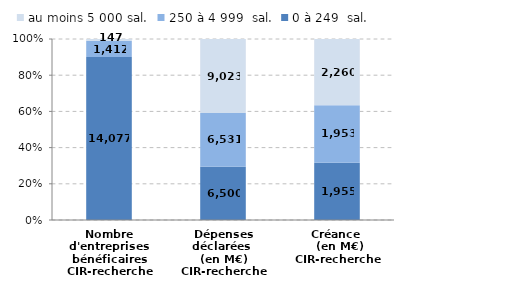
| Category | 0 à 249  sal. | 250 à 4 999  sal. | au moins 5 000 sal. |
|---|---|---|---|
| Nombre d'entreprises bénéficaires
CIR-recherche | 14077 | 1412 | 147 |
| Dépenses déclarées 
(en M€)
CIR-recherche | 6500.2 | 6530.6 | 9023.3 |
| Créance 
 (en M€)
CIR-recherche | 1954.9 | 1953 | 2260.4 |